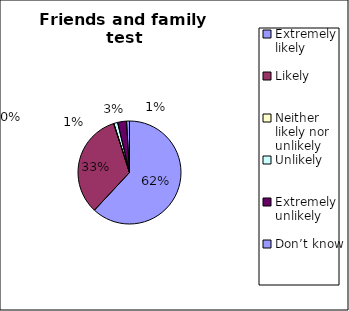
| Category | Series 0 |
|---|---|
| Extremely likely  | 200 |
| Likely  | 107 |
| Neither likely nor unlikely | 0 |
| Unlikely  | 4 |
| Extremely unlikely  | 9 |
| Don’t know  | 3 |